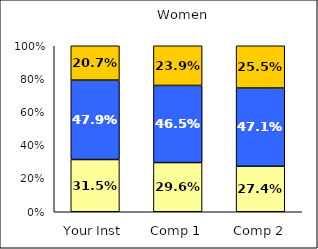
| Category | Low Likelihood of College Involvement | Average Likelihood of College Involvement | High Likelihood of College Involvement |
|---|---|---|---|
| Your Inst | 0.315 | 0.479 | 0.207 |
| Comp 1 | 0.296 | 0.465 | 0.239 |
| Comp 2 | 0.274 | 0.471 | 0.255 |